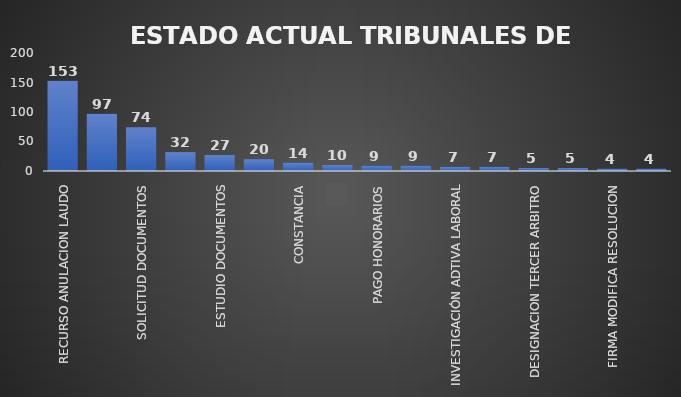
| Category | CANTIDAD | % |
|---|---|---|
| RECURSO ANULACION LAUDO | 153 | 0.321 |
| ESPERA DE LAUDO | 97 | 0.163 |
| SOLICITUD DOCUMENTOS | 74 | 0.152 |
| PROYECTO ARCHIVO | 32 | 0.075 |
| ESTUDIO DOCUMENTOS | 27 | 0.058 |
| FIRMA CONVOCA E INTEGRA | 20 | 0.045 |
| CONSTANCIA | 14 | 0.029 |
| AUTO DE TERMINOS | 10 | 0.018 |
| PAGO HONORARIOS | 9 | 0.014 |
| ARCHIVADO | 9 | 0.017 |
| INVESTIGACIÓN ADTIVA LABORAL | 7 | 0.017 |
| POSESION ARBITROS | 7 | 0.016 |
| DESIGNACION TERCER ARBITRO | 5 | 0.013 |
| PROYECTO RECURSO REPOSICION | 5 | 0.008 |
| FIRMA MODIFICA RESOLUCION | 4 | 0.009 |
| POSESION TERCER ARBITRO | 4 | 0.009 |